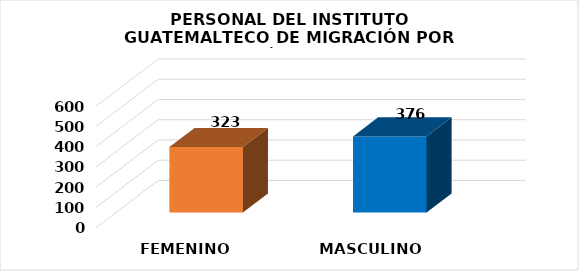
| Category | Series 0 |
|---|---|
| FEMENINO | 323 |
| MASCULINO | 376 |